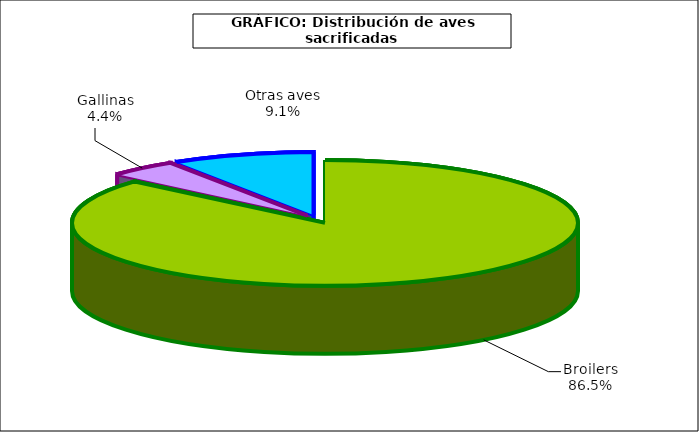
| Category | Series 0 |
|---|---|
| 0 | 680711.012 |
| 1 | 34953.064 |
| 2 | 71648.44 |